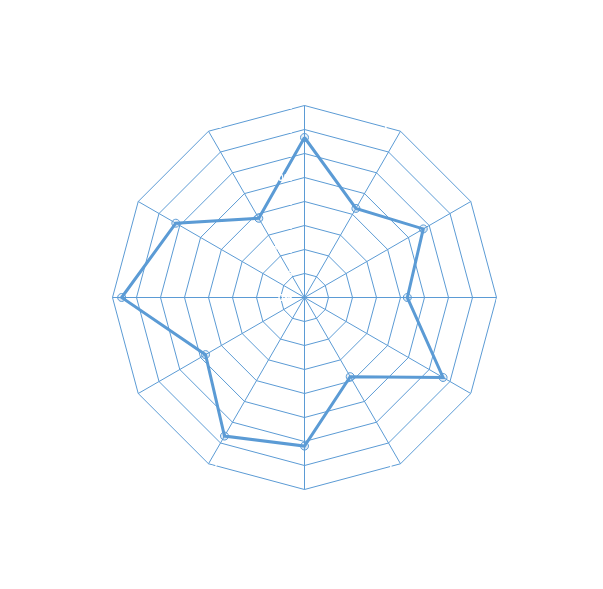
| Category | Series 0 |
|---|---|
| January,  67% | 0.667 |
| February,  43% | 0.429 |
| March,  57% | 0.571 |
| April,  43% | 0.429 |
| May,  67% | 0.667 |
| June,  38% | 0.381 |
| July,  62% | 0.619 |
| August,  67% | 0.667 |
| September,  48% | 0.476 |
| October,  76% | 0.762 |
| November,  62% | 0.619 |
| December,  38% | 0.381 |